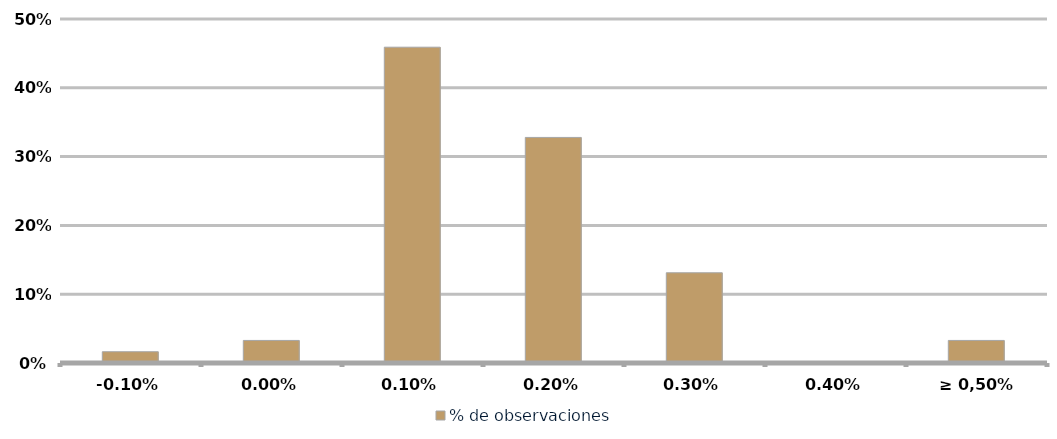
| Category | % de observaciones  |
|---|---|
| -0.10% | 0.016 |
| 0.00% | 0.033 |
| 0.10% | 0.459 |
| 0.20% | 0.328 |
| 0.30% | 0.131 |
| 0.40% | 0 |
| ≥ 0,50% | 0.033 |